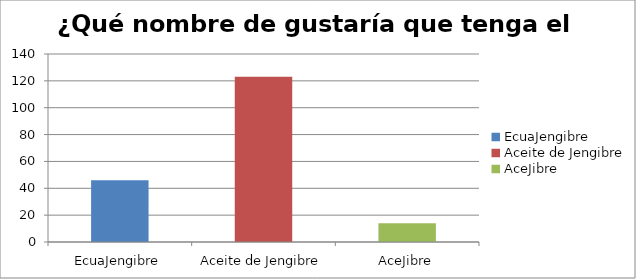
| Category | ¿Qué nombre de gustaría que tenga el producto? |
|---|---|
| EcuaJengibre | 46 |
| Aceite de Jengibre | 123 |
| AceJibre | 14 |